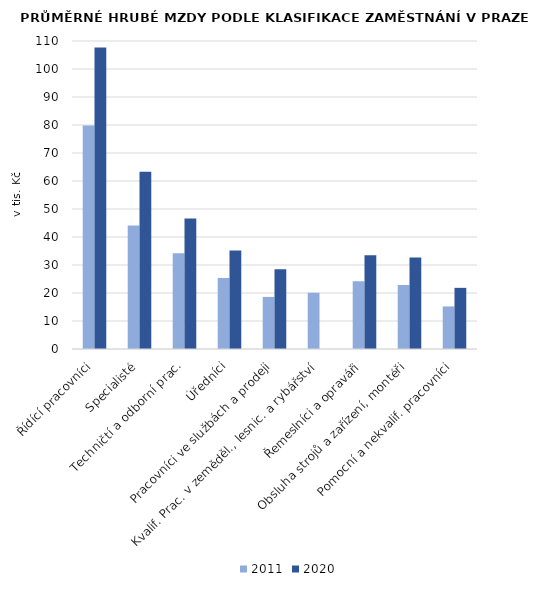
| Category | 2011 | 2020 |
|---|---|---|
| Řídící pracovníci | 79816 | 107665 |
| Specialisté | 44097 | 63295 |
| Techničtí a odborní prac. | 34219 | 46593 |
| Úředníci | 25336 | 35152 |
| Pracovníci ve službách a prodeji | 18595 | 28486 |
| Kvalif. Prac. v zeměděl., lesnic. a rybářství | 20095 | 0 |
| Řemeslníci a opraváři | 24164 | 33516 |
| Obsluha strojů a zařízení, montéři | 22888 | 32655 |
| Pomocní a nekvalif. pracovníci | 15201 | 21838 |